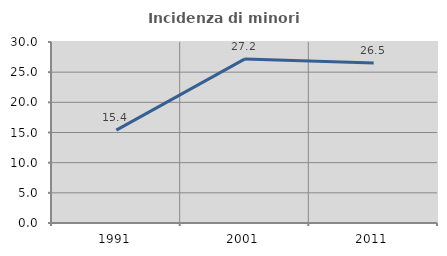
| Category | Incidenza di minori stranieri |
|---|---|
| 1991.0 | 15.385 |
| 2001.0 | 27.193 |
| 2011.0 | 26.512 |